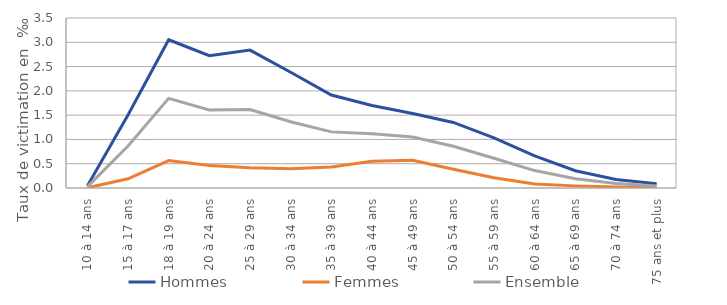
| Category | Hommes | Femmes | Ensemble |
|---|---|---|---|
| 10 à 14 ans | 0.041 | 0.006 | 0.024 |
| 15 à 17 ans | 1.502 | 0.19 | 0.863 |
| 18 à 19 ans | 3.052 | 0.565 | 1.845 |
| 20 à 24 ans | 2.723 | 0.462 | 1.608 |
| 25 à 29 ans | 2.839 | 0.415 | 1.616 |
| 30 à 34 ans | 2.384 | 0.395 | 1.363 |
| 35 à 39 ans | 1.913 | 0.433 | 1.156 |
| 40 à 44 ans | 1.699 | 0.549 | 1.116 |
| 45 à 49 ans | 1.535 | 0.569 | 1.048 |
| 50 à 54 ans | 1.35 | 0.384 | 0.86 |
| 55 à 59 ans | 1.033 | 0.211 | 0.611 |
| 60 à 64 ans | 0.66 | 0.084 | 0.359 |
| 65 à 69 ans | 0.355 | 0.044 | 0.19 |
| 70 à 74 ans | 0.174 | 0.02 | 0.091 |
| 75 ans et plus | 0.085 | 0.01 | 0.04 |